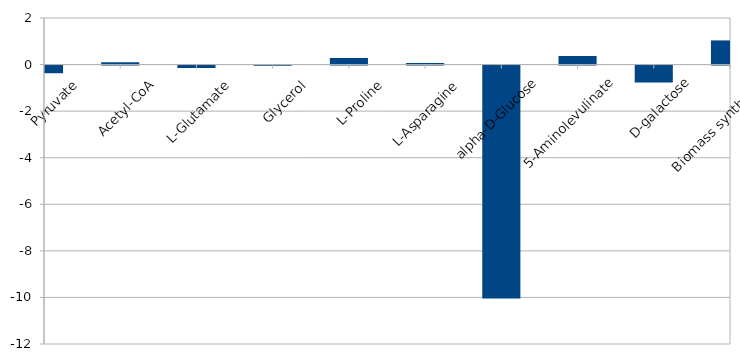
| Category | Series 0 |
|---|---|
| Pyruvate | -0.328 |
| Acetyl-CoA | 0.1 |
| L-Glutamate | -0.1 |
| Glycerol | -0.013 |
| L-Proline | 0.282 |
| L-Asparagine | 0.065 |
| alpha-D-Glucose | -10 |
| 5-Aminolevulinate | 0.364 |
| D-galactose | -0.723 |
| Biomass synthesis  | 1.038 |